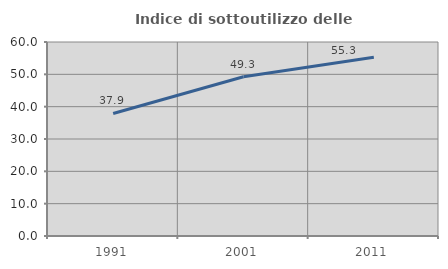
| Category | Indice di sottoutilizzo delle abitazioni  |
|---|---|
| 1991.0 | 37.89 |
| 2001.0 | 49.258 |
| 2011.0 | 55.294 |